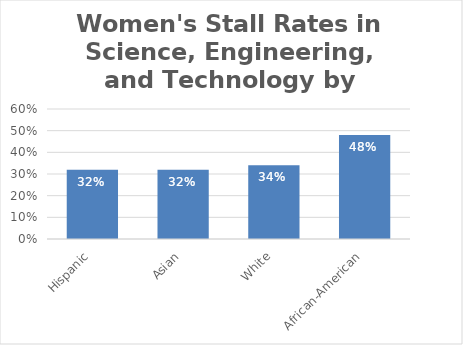
| Category | Percent of Women Who Quit |
|---|---|
| Hispanic | 0.32 |
| Asian | 0.32 |
| White | 0.34 |
| African-American | 0.48 |